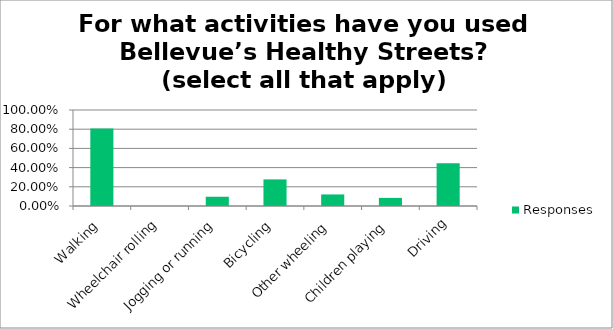
| Category | Responses |
|---|---|
| Walking | 0.807 |
| Wheelchair rolling | 0 |
| Jogging or running | 0.096 |
| Bicycling | 0.277 |
| Other wheeling | 0.12 |
| Children playing | 0.084 |
| Driving | 0.446 |